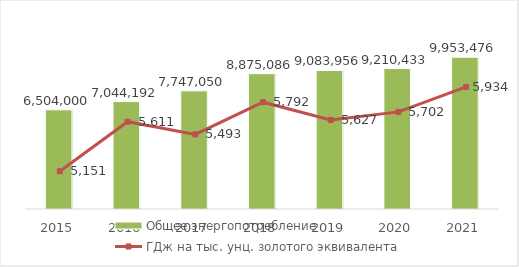
| Category | Общее энергопотребление |
|---|---|
| 2015.0 | 6504000 |
| 2016.0 | 7044192 |
| 2017.0 | 7747050 |
| 2018.0 | 8875086 |
| 2019.0 | 9083956 |
| 2020.0 | 9210433 |
| 2021.0 | 9953476 |